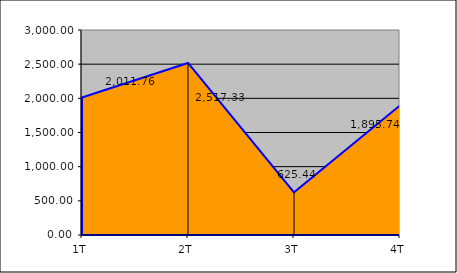
| Category | Series 0 |
|---|---|
| 1T | 2011.76 |
| 2T | 2517.33 |
| 3T | 625.44 |
| 4T | 1895.74 |